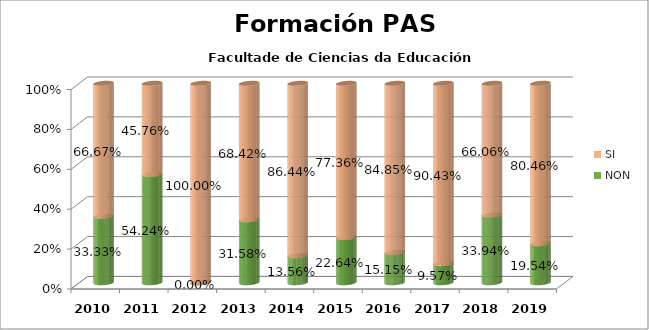
| Category | NON | SI |
|---|---|---|
| 2010.0 | 0.333 | 0.667 |
| 2011.0 | 0.542 | 0.458 |
| 2012.0 | 0 | 1 |
| 2013.0 | 0.316 | 0.684 |
| 2014.0 | 0.136 | 0.864 |
| 2015.0 | 0.226 | 0.774 |
| 2016.0 | 0.152 | 0.848 |
| 2017.0 | 0.096 | 0.904 |
| 2018.0 | 0.339 | 0.661 |
| 2019.0 | 0.195 | 0.805 |